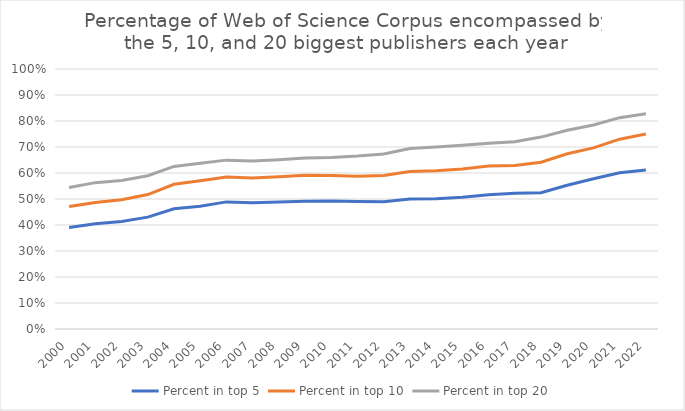
| Category | Percent in top 5 | Percent in top 10 | Percent in top 20 |
|---|---|---|---|
| 2000.0 | 0.391 | 0.471 | 0.544 |
| 2001.0 | 0.405 | 0.487 | 0.563 |
| 2002.0 | 0.413 | 0.497 | 0.571 |
| 2003.0 | 0.43 | 0.517 | 0.589 |
| 2004.0 | 0.462 | 0.557 | 0.625 |
| 2005.0 | 0.472 | 0.57 | 0.638 |
| 2006.0 | 0.489 | 0.585 | 0.649 |
| 2007.0 | 0.485 | 0.581 | 0.646 |
| 2008.0 | 0.489 | 0.586 | 0.651 |
| 2009.0 | 0.491 | 0.591 | 0.658 |
| 2010.0 | 0.493 | 0.591 | 0.66 |
| 2011.0 | 0.49 | 0.588 | 0.665 |
| 2012.0 | 0.489 | 0.59 | 0.673 |
| 2013.0 | 0.5 | 0.606 | 0.694 |
| 2014.0 | 0.501 | 0.609 | 0.7 |
| 2015.0 | 0.507 | 0.616 | 0.707 |
| 2016.0 | 0.516 | 0.627 | 0.715 |
| 2017.0 | 0.522 | 0.629 | 0.72 |
| 2018.0 | 0.524 | 0.641 | 0.738 |
| 2019.0 | 0.553 | 0.674 | 0.765 |
| 2020.0 | 0.578 | 0.697 | 0.785 |
| 2021.0 | 0.601 | 0.73 | 0.813 |
| 2022.0 | 0.611 | 0.75 | 0.828 |